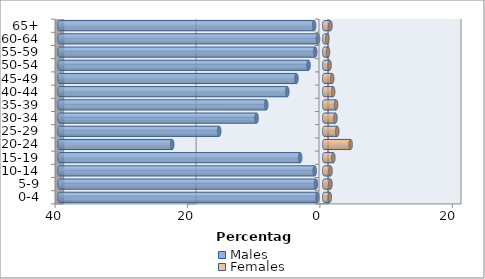
| Category | Males | Females |
|---|---|---|
| 0-4 | -1.02 | 0.84 |
| 5-9 | -1.25 | 0.942 |
| 10-14 | -1.437 | 0.95 |
| 15-19 | -3.637 | 1.378 |
| 20-24 | -22.954 | 3.989 |
| 25-29 | -15.863 | 1.966 |
| 30-34 | -10.212 | 1.697 |
| 35-39 | -8.759 | 1.789 |
| 40-44 | -5.582 | 1.353 |
| 45-49 | -4.194 | 1.207 |
| 50-54 | -2.371 | 0.812 |
| 55-59 | -1.351 | 0.57 |
| 60-64 | -0.936 | 0.474 |
| 65+ | -1.526 | 0.942 |